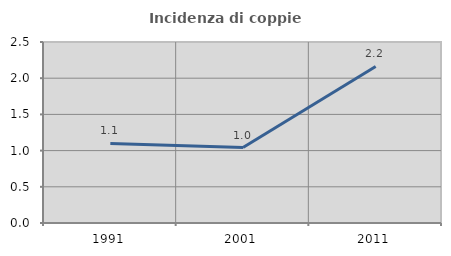
| Category | Incidenza di coppie miste |
|---|---|
| 1991.0 | 1.099 |
| 2001.0 | 1.042 |
| 2011.0 | 2.162 |